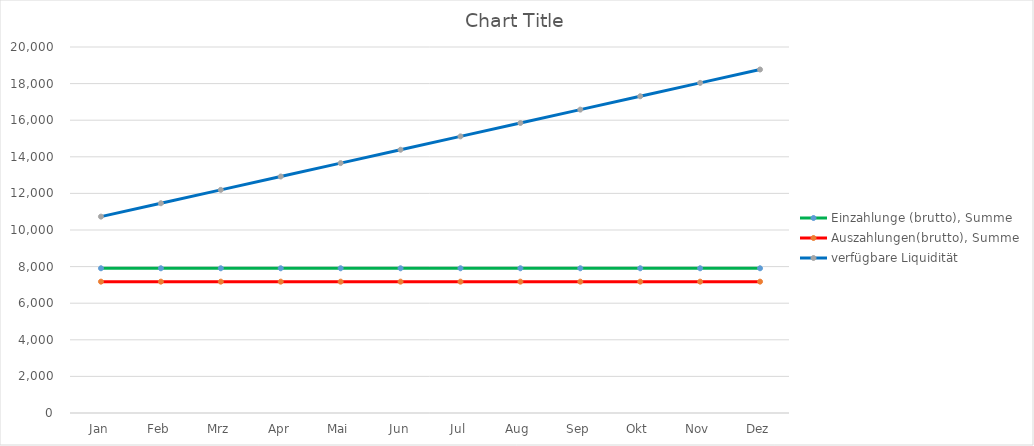
| Category | Einzahlunge (brutto), Summe | Auszahlungen(brutto), Summe | verfügbare Liquidität |
|---|---|---|---|
| Jan | 7908.5 | 7177.66 | 10730.84 |
| Feb | 7908.5 | 7177.66 | 11461.68 |
| Mrz | 7908.5 | 7177.66 | 12192.52 |
| Apr | 7908.5 | 7177.66 | 12923.36 |
| Mai | 7908.5 | 7177.66 | 13654.2 |
| Jun | 7908.5 | 7177.66 | 14385.04 |
| Jul | 7908.5 | 7177.66 | 15115.88 |
| Aug | 7908.5 | 7177.66 | 15846.72 |
| Sep | 7908.5 | 7177.66 | 16577.56 |
| Okt | 7908.5 | 7177.66 | 17308.4 |
| Nov | 7908.5 | 7177.66 | 18039.24 |
| Dez | 7908.5 | 7177.66 | 18770.08 |